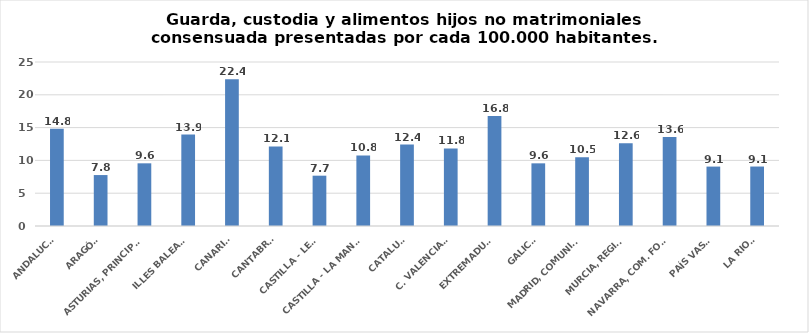
| Category | Series 0 |
|---|---|
| ANDALUCÍA | 14.812 |
| ARAGÓN | 7.766 |
| ASTURIAS, PRINCIPADO | 9.555 |
| ILLES BALEARS | 13.938 |
| CANARIAS | 22.363 |
| CANTABRIA | 12.128 |
| CASTILLA - LEÓN | 7.671 |
| CASTILLA - LA MANCHA | 10.763 |
| CATALUÑA | 12.409 |
| C. VALENCIANA | 11.828 |
| EXTREMADURA | 16.781 |
| GALICIA | 9.552 |
| MADRID, COMUNIDAD | 10.474 |
| MURCIA, REGIÓN | 12.599 |
| NAVARRA, COM. FORAL | 13.552 |
| PAÍS VASCO | 9.057 |
| LA RIOJA | 9.066 |